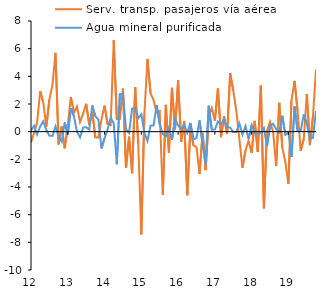
| Category | Serv. transp. pasajeros vía aérea | Agua mineral purificada |
|---|---|---|
| 2012-01-01 | -0.774 | 0.082 |
| 2012-02-01 | -0.098 | 0.418 |
| 2012-03-01 | 0.675 | -0.201 |
| 2012-04-01 | 2.932 | 0.379 |
| 2012-05-01 | 2.109 | 0.747 |
| 2012-06-01 | 0.371 | 0.13 |
| 2012-07-01 | 2.323 | -0.3 |
| 2012-08-01 | 3.374 | -0.305 |
| 2012-09-01 | 5.698 | 0.38 |
| 2012-10-01 | -0.921 | -0.368 |
| 2012-11-01 | 0.368 | -0.722 |
| 2012-12-01 | -1.201 | 0.661 |
| 2013-01-01 | 0.465 | -0.197 |
| 2013-02-01 | 2.504 | 1.694 |
| 2013-03-01 | 1.369 | 1.114 |
| 2013-04-01 | 1.808 | 0.001 |
| 2013-05-01 | 0.699 | -0.415 |
| 2013-06-01 | 1.288 | 0.298 |
| 2013-07-01 | 2.013 | 0.324 |
| 2013-08-01 | 0.504 | 0.143 |
| 2013-09-01 | 1.438 | 1.887 |
| 2013-10-01 | -0.412 | 1.117 |
| 2013-11-01 | -0.433 | 0.877 |
| 2013-12-01 | 0.888 | -1.216 |
| 2014-01-01 | 1.887 | -0.479 |
| 2014-02-01 | 0.556 | 0.164 |
| 2014-03-01 | 0.472 | 1.011 |
| 2014-04-01 | 6.604 | 0.593 |
| 2014-05-01 | 0.916 | -2.356 |
| 2014-06-01 | 0.922 | 2.722 |
| 2014-07-01 | 3.109 | 2.737 |
| 2014-08-01 | -2.621 | 0.186 |
| 2014-09-01 | -0.359 | -0.102 |
| 2014-10-01 | -3.004 | 1.675 |
| 2014-11-01 | 3.231 | 1.704 |
| 2014-12-01 | -0.875 | 0.967 |
| 2015-01-01 | -7.427 | 1.252 |
| 2015-02-01 | 1.252 | -0.092 |
| 2015-03-01 | 5.243 | -0.671 |
| 2015-04-01 | 2.78 | 0.429 |
| 2015-05-01 | 2.276 | 0.453 |
| 2015-06-01 | 1.393 | 1.911 |
| 2015-07-01 | 1.494 | 0.538 |
| 2015-08-01 | -4.58 | -0.168 |
| 2015-09-01 | 1.939 | -0.337 |
| 2015-10-01 | -1.504 | 0.283 |
| 2015-11-01 | 3.166 | -0.584 |
| 2015-12-01 | 0.154 | 0.893 |
| 2016-01-01 | 3.712 | 0.445 |
| 2016-02-01 | -0.735 | 0.186 |
| 2016-03-01 | 0.751 | 0.491 |
| 2016-04-01 | -4.593 | -0.084 |
| 2016-05-01 | 0.307 | 0.634 |
| 2016-06-01 | -0.998 | -0.554 |
| 2016-07-01 | -1.114 | -0.461 |
| 2016-08-01 | -3.057 | 0.818 |
| 2016-09-01 | -0.082 | -0.916 |
| 2016-10-01 | -2.78 | -2.289 |
| 2016-11-01 | 1.097 | 1.874 |
| 2016-12-01 | 1.712 | 0.134 |
| 2017-01-01 | 0.796 | 0.155 |
| 2017-02-01 | 3.128 | 0.737 |
| 2017-03-01 | -0.399 | 0.533 |
| 2017-04-01 | 1.116 | 0.88 |
| 2017-05-01 | -0.173 | 0.323 |
| 2017-06-01 | 4.215 | 0.299 |
| 2017-07-01 | 2.976 | -0.033 |
| 2017-08-01 | 1.51 | -0.029 |
| 2017-09-01 | -0.559 | 0.595 |
| 2017-10-01 | -2.605 | -0.213 |
| 2017-11-01 | -1.354 | 0.409 |
| 2017-12-01 | -0.648 | -0.53 |
| 2018-01-01 | -1.542 | 0.475 |
| 2018-02-01 | 0.779 | -0.111 |
| 2018-03-01 | -1.464 | -0.149 |
| 2018-04-01 | 3.327 | -0.104 |
| 2018-05-01 | -5.543 | 0.264 |
| 2018-06-01 | 0.057 | -1.054 |
| 2018-07-01 | 0.711 | 0.398 |
| 2018-08-01 | -0.003 | 0.576 |
| 2018-09-01 | -2.485 | 0.188 |
| 2018-10-01 | 2.085 | -0.048 |
| 2018-11-01 | -1.154 | 1.154 |
| 2018-12-01 | -2.195 | -0.228 |
| 2019-01-01 | -3.769 | -0.045 |
| 2019-02-01 | 2.257 | -1.819 |
| 2019-03-01 | 3.677 | 1.821 |
| 2019-04-01 | 1.474 | 0.062 |
| 2019-05-01 | -1.375 | 0.049 |
| 2019-06-01 | -0.551 | 1.238 |
| 2019-07-01 | 2.724 | 0.577 |
| 2019-08-01 | -0.97 | -0.494 |
| 2019-09-01 | 1.074 | -0.443 |
| 2019-10-01 | 4.506 | 1.486 |